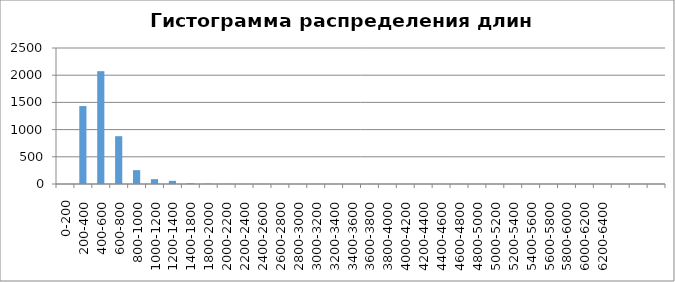
| Category | Частота |
|---|---|
| 0-200 | 0 |
| 200-400 | 1433 |
| 400-600 | 2074 |
| 600-800 | 879 |
| 800-1000 | 255 |
| 1000-1200 | 89 |
| 1200-1400 | 58 |
| 1400-1800 | 13 |
| 1800-2000 | 5 |
| 2000-2200 | 3 |
| 2200-2400 | 0 |
| 2400-2600 | 1 |
| 2600-2800 | 0 |
| 2800-3000 | 0 |
| 3000-3200 | 1 |
| 3200-3400 | 0 |
| 3400-3600 | 0 |
| 3600-3800 | 1 |
| 3800-4000 | 0 |
| 4000-4200 | 0 |
| 4200-4400 | 0 |
| 4400-4600 | 0 |
| 4600-4800 | 1 |
| 4800-5000 | 0 |
| 5000-5200 | 0 |
| 5200-5400 | 0 |
| 5400-5600 | 0 |
| 5600-5800 | 0 |
| 5800-6000 | 0 |
| 6000-6200 | 0 |
| 6200-6400 | 0 |